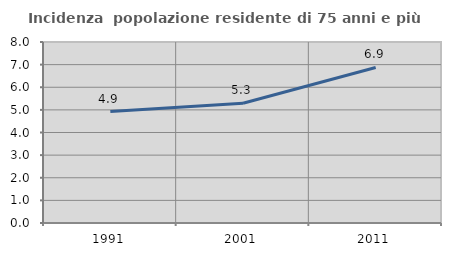
| Category | Incidenza  popolazione residente di 75 anni e più |
|---|---|
| 1991.0 | 4.927 |
| 2001.0 | 5.292 |
| 2011.0 | 6.873 |